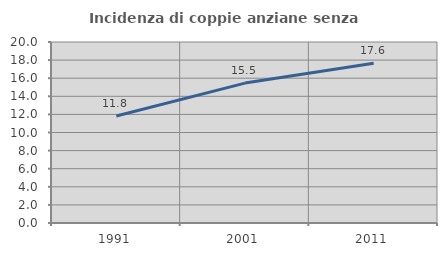
| Category | Incidenza di coppie anziane senza figli  |
|---|---|
| 1991.0 | 11.823 |
| 2001.0 | 15.459 |
| 2011.0 | 17.647 |